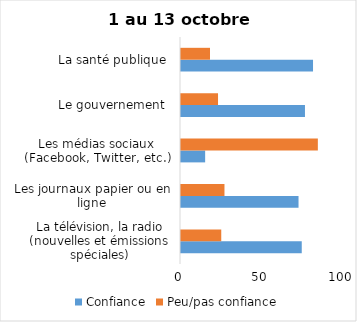
| Category | Confiance | Peu/pas confiance |
|---|---|---|
| La télévision, la radio (nouvelles et émissions spéciales) | 75 | 25 |
| Les journaux papier ou en ligne | 73 | 27 |
| Les médias sociaux (Facebook, Twitter, etc.) | 15 | 85 |
| Le gouvernement  | 77 | 23 |
| La santé publique  | 82 | 18 |